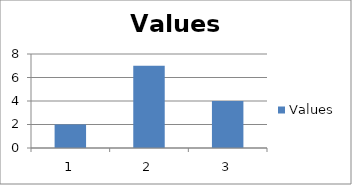
| Category | Values |
|---|---|
| 0 | 2 |
| 1 | 7 |
| 2 | 4 |